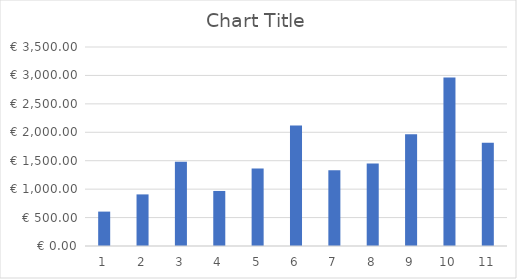
| Category | Series 0 |
|---|---|
| 0 | 605 |
| 1/1/00 | 907.5 |
| 1/2/00 | 1482.25 |
| 1/3/00 | 968 |
| 1/4/00 | 1361.25 |
| 1/5/00 | 2117.5 |
| 1/6/00 | 1331 |
| 1/7/00 | 1452 |
| 1/8/00 | 1966.25 |
| 1/9/00 | 2964.5 |
| 1/10/00 | 1815 |